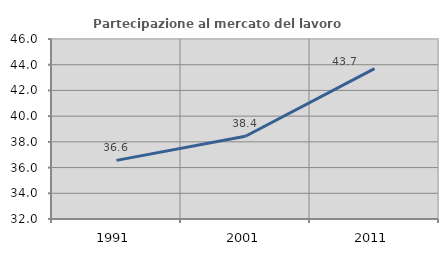
| Category | Partecipazione al mercato del lavoro  femminile |
|---|---|
| 1991.0 | 36.559 |
| 2001.0 | 38.433 |
| 2011.0 | 43.7 |